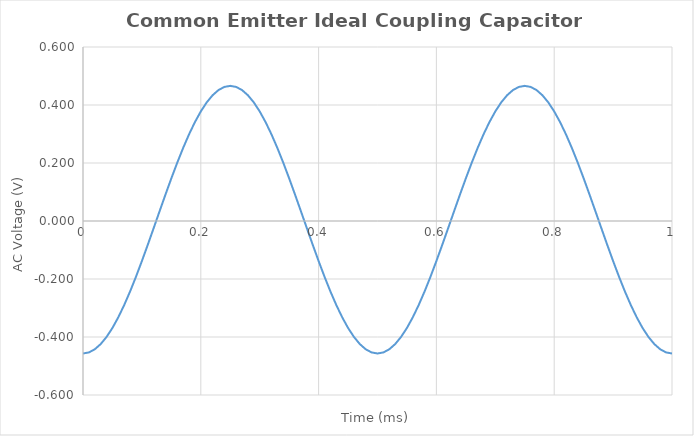
| Category | VC(t) CC |
|---|---|
| 0.0 | -0.457 |
| 0.01 | -0.453 |
| 0.02 | -0.442 |
| 0.03 | -0.424 |
| 0.04 | -0.4 |
| 0.05 | -0.369 |
| 0.06 | -0.332 |
| 0.07 | -0.29 |
| 0.08 | -0.243 |
| 0.09 | -0.192 |
| 0.1 | -0.138 |
| 0.11 | -0.082 |
| 0.12 | -0.024 |
| 0.13 | 0.034 |
| 0.14 | 0.091 |
| 0.15 | 0.147 |
| 0.16 | 0.201 |
| 0.17 | 0.252 |
| 0.18 | 0.299 |
| 0.19 | 0.341 |
| 0.2 | 0.378 |
| 0.21 | 0.409 |
| 0.22 | 0.434 |
| 0.23 | 0.451 |
| 0.24 | 0.462 |
| 0.25 | 0.466 |
| 0.26 | 0.462 |
| 0.27 | 0.451 |
| 0.28 | 0.434 |
| 0.29 | 0.409 |
| 0.3 | 0.378 |
| 0.31 | 0.341 |
| 0.32 | 0.299 |
| 0.33 | 0.252 |
| 0.34 | 0.201 |
| 0.35 | 0.147 |
| 0.36 | 0.091 |
| 0.37 | 0.034 |
| 0.38 | -0.024 |
| 0.39 | -0.082 |
| 0.4 | -0.138 |
| 0.41 | -0.192 |
| 0.42 | -0.243 |
| 0.43 | -0.29 |
| 0.44 | -0.332 |
| 0.45 | -0.369 |
| 0.46 | -0.4 |
| 0.47 | -0.424 |
| 0.48 | -0.442 |
| 0.49 | -0.453 |
| 0.5 | -0.457 |
| 0.51 | -0.453 |
| 0.52 | -0.442 |
| 0.53 | -0.424 |
| 0.54 | -0.4 |
| 0.55 | -0.369 |
| 0.56 | -0.332 |
| 0.57 | -0.29 |
| 0.58 | -0.243 |
| 0.59 | -0.192 |
| 0.6 | -0.138 |
| 0.61 | -0.082 |
| 0.62 | -0.024 |
| 0.63 | 0.034 |
| 0.64 | 0.091 |
| 0.65 | 0.147 |
| 0.66 | 0.201 |
| 0.67 | 0.252 |
| 0.68 | 0.299 |
| 0.69 | 0.341 |
| 0.7 | 0.378 |
| 0.71 | 0.409 |
| 0.72 | 0.434 |
| 0.73 | 0.451 |
| 0.74 | 0.462 |
| 0.75 | 0.466 |
| 0.76 | 0.462 |
| 0.77 | 0.451 |
| 0.78 | 0.434 |
| 0.79 | 0.409 |
| 0.8 | 0.378 |
| 0.81 | 0.341 |
| 0.82 | 0.299 |
| 0.83 | 0.252 |
| 0.84 | 0.201 |
| 0.85 | 0.147 |
| 0.86 | 0.091 |
| 0.87 | 0.034 |
| 0.88 | -0.024 |
| 0.89 | -0.082 |
| 0.9 | -0.138 |
| 0.91 | -0.192 |
| 0.92 | -0.243 |
| 0.93 | -0.29 |
| 0.94 | -0.332 |
| 0.95 | -0.369 |
| 0.96 | -0.4 |
| 0.97 | -0.424 |
| 0.98 | -0.442 |
| 0.99 | -0.453 |
| 1.0 | -0.457 |